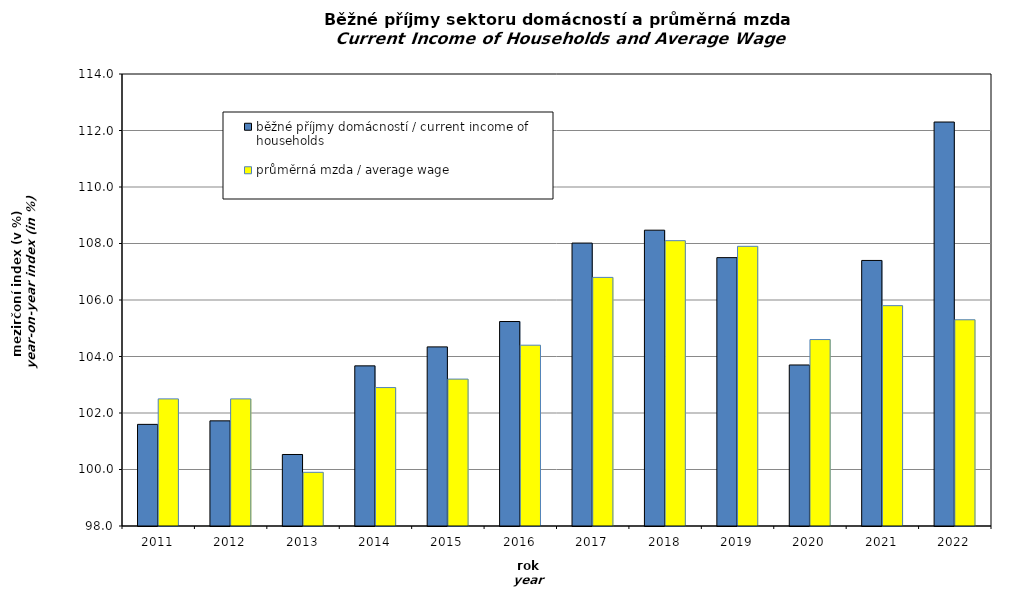
| Category | běžné příjmy domácností / current income of households | průměrná mzda / average wage |
|---|---|---|
| 2011.0 | 101.598 | 102.5 |
| 2012.0 | 101.722 | 102.5 |
| 2013.0 | 100.531 | 99.9 |
| 2014.0 | 103.668 | 102.9 |
| 2015.0 | 104.341 | 103.2 |
| 2016.0 | 105.238 | 104.4 |
| 2017.0 | 108.015 | 106.8 |
| 2018.0 | 108.472 | 108.1 |
| 2019.0 | 107.5 | 107.9 |
| 2020.0 | 103.7 | 104.6 |
| 2021.0 | 107.4 | 105.8 |
| 2022.0 | 112.3 | 105.3 |